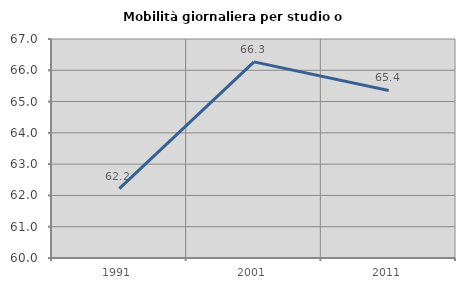
| Category | Mobilità giornaliera per studio o lavoro |
|---|---|
| 1991.0 | 62.216 |
| 2001.0 | 66.268 |
| 2011.0 | 65.355 |